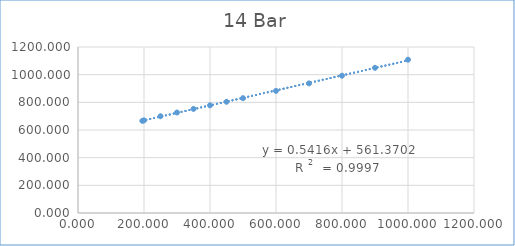
| Category | Series 0 |
|---|---|
| 195.0 | 666.221 |
| 200.0 | 669.613 |
| 250.0 | 699.451 |
| 300.0 | 726.445 |
| 350.0 | 752.532 |
| 400.0 | 778.333 |
| 450.0 | 804.133 |
| 500.0 | 830.1 |
| 600.0 | 882.8 |
| 700.0 | 936.861 |
| 800.0 | 992.427 |
| 900.0 | 1049.522 |
| 1000.0 | 1108.17 |